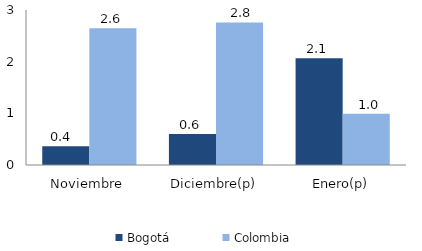
| Category | Bogotá | Colombia |
|---|---|---|
| Noviembre | 0.364 | 2.648 |
| Diciembre(p) | 0.6 | 2.758 |
| Enero(p) | 2.066 | 0.991 |